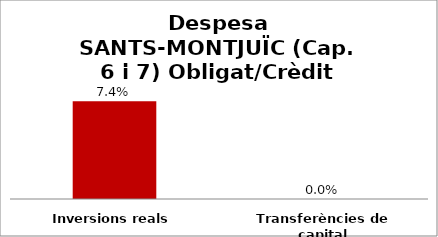
| Category | Series 0 |
|---|---|
| Inversions reals | 0.074 |
| Transferències de capital | 0 |